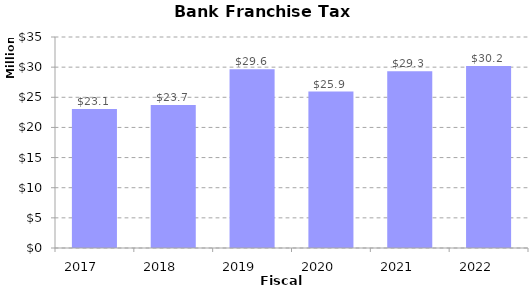
| Category | Series 0 |
|---|---|
| 2017.0 | 23068000 |
| 2018.0 | 23724800 |
| 2019.0 | 29641360 |
| 2020.0 | 25949060 |
| 2021.0 | 29336130 |
| 2022.0 | 30170420 |